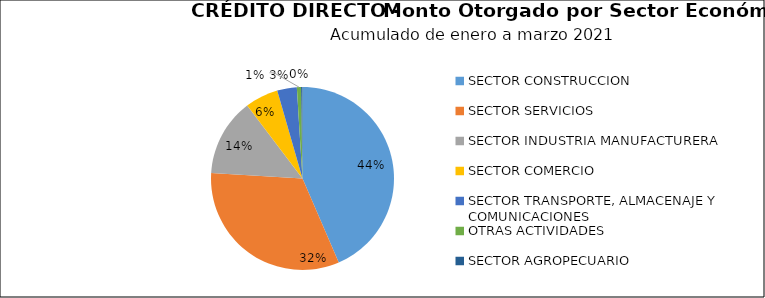
| Category | Monto | Créditos |
|---|---|---|
| SECTOR CONSTRUCCION | 35.175 | 3 |
| SECTOR SERVICIOS | 26.217 | 16 |
| SECTOR INDUSTRIA MANUFACTURERA | 11.082 | 6 |
| SECTOR COMERCIO | 4.75 | 3 |
| SECTOR TRANSPORTE, ALMACENAJE Y COMUNICACIONES | 2.8 | 1 |
| OTRAS ACTIVIDADES | 0.6 | 1 |
| SECTOR AGROPECUARIO | 0.202 | 2 |